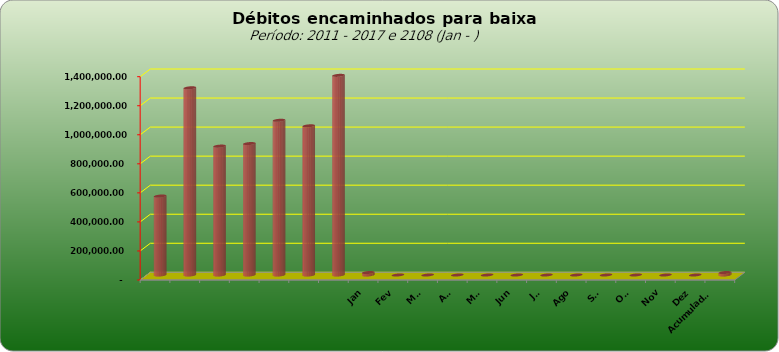
| Category |  543.796,20  |
|---|---|
|  | 543796.2 |
|  | 1289053.69 |
|  | 887573.08 |
|  | 905052.31 |
|  | 1065434.28 |
|  | 1027209.41 |
|  | 1374800.36 |
| Jan | 17005.62 |
| Fev | 0 |
| Mar | 0 |
| Abr | 0 |
| Mai | 0 |
| Jun | 0 |
| Jul | 0 |
| Ago | 0 |
| Set | 0 |
| Out | 0 |
| Nov | 0 |
| Dez | 0 |
| Acumulado
2016 | 17005.62 |